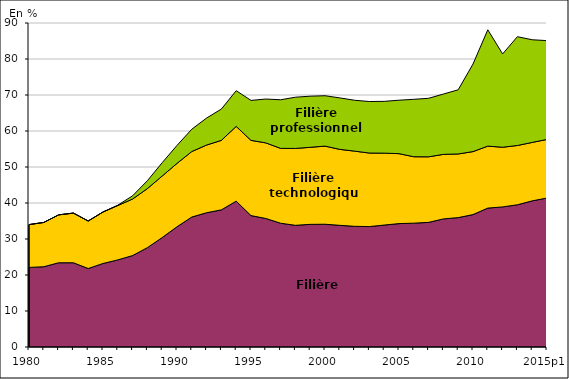
| Category | Filière générale | Filière technologique | Filière professionnelle |
|---|---|---|---|
| 1980 | 22.1 | 11.9 | 0 |
| 1981 | 22.3 | 12.3 | 0 |
| 1982 | 23.4 | 13.3 | 0 |
| 1983 | 23.4 | 13.8 | 0 |
| 1984 | 21.8 | 13.2 | 0 |
| 1985 | 23.2 | 14.3 | 0 |
| 1986 | 24.2 | 15.1 | 0.1 |
| 1987 | 25.4 | 15.7 | 0.9 |
| 1988 | 27.6 | 16.4 | 2.2 |
| 1989 | 30.4 | 17.1 | 3.7 |
| 1990 | 33.4 | 17.6 | 5 |
| 1991 | 36.1 | 18.2 | 6.2 |
| 1992 | 37.3 | 18.8 | 7.5 |
| 1993 | 38.1 | 19.3 | 8.7 |
| 1994 | 40.514 | 20.758 | 9.928 |
| 1995 | 36.5 | 20.9 | 11.1 |
| 1996 | 35.7 | 21 | 12.184 |
| 1997 | 34.384 | 20.792 | 13.5 |
| 1998 | 33.8 | 21.359 | 14.229 |
| 1999 | 34.071 | 21.4 | 14.2 |
| 2000 | 34.1 | 21.7 | 14 |
| 2001 | 33.8 | 21.1 | 14.3 |
| 2002 | 33.521 | 20.889 | 14.125 |
| 2003 | 33.453 | 20.427 | 14.309 |
| 2004 | 33.874 | 19.972 | 14.392 |
| 2005 | 34.277 | 19.433 | 14.843 |
| 2006 | 34.401 | 18.449 | 15.954 |
| 2007 | 34.622 | 18.205 | 16.261 |
| 2008 | 35.585 | 17.923 | 16.754 |
| 2009 | 35.941 | 17.682 | 17.823 |
| 2010 | 36.78 | 17.498 | 24.324 |
| 2011 | 38.589 | 17.214 | 32.317 |
| 2012 | 38.918 | 16.569 | 25.924 |
| 2013p | 39.507 | 16.466 | 30.229 |
| 2014p | 40.594 | 16.232 | 28.52 |
| 2015p1 | 41.383 | 16.28 | 27.444 |